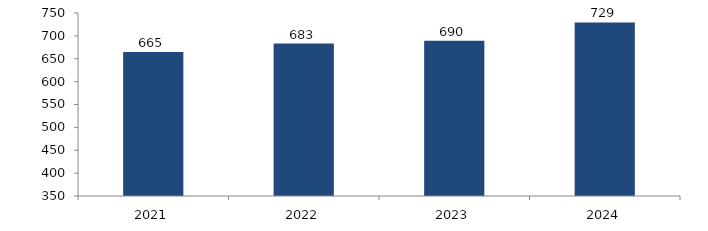
| Category | Bogotá |
|---|---|
| 2021.0 | 664.726 |
| 2022.0 | 683.302 |
| 2023.0 | 689.585 |
| 2024.0 | 729.469 |